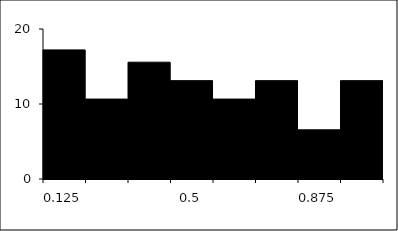
| Category | Series 1 |
|---|---|
| 0.125 | 17.213 |
| 0.25 | 10.656 |
| 0.375 | 15.574 |
| 0.5 | 13.115 |
| 0.625 | 10.656 |
| 0.75 | 13.115 |
| 0.875 | 6.557 |
| 1.0 | 13.115 |